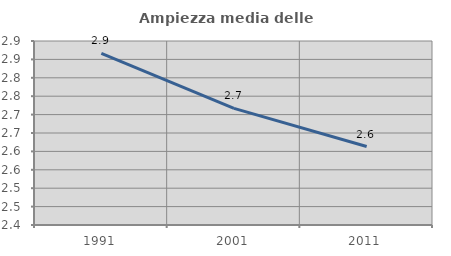
| Category | Ampiezza media delle famiglie |
|---|---|
| 1991.0 | 2.866 |
| 2001.0 | 2.717 |
| 2011.0 | 2.613 |